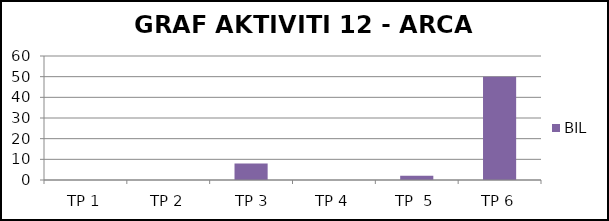
| Category | BIL |
|---|---|
| TP 1 | 0 |
| TP 2 | 0 |
|  TP 3 | 8 |
| TP 4 | 0 |
| TP  5 | 2 |
| TP 6 | 50 |